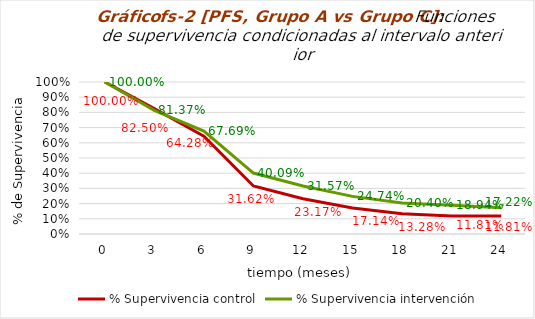
| Category | % Supervivencia control | % Supervivencia intervención |
|---|---|---|
| 0.0 | 1 | 1 |
| 3.0 | 0.825 | 0.814 |
| 6.0 | 0.643 | 0.677 |
| 9.0 | 0.316 | 0.401 |
| 12.0 | 0.232 | 0.316 |
| 15.0 | 0.171 | 0.247 |
| 18.0 | 0.133 | 0.204 |
| 21.0 | 0.118 | 0.189 |
| 24.0 | 0.118 | 0.172 |